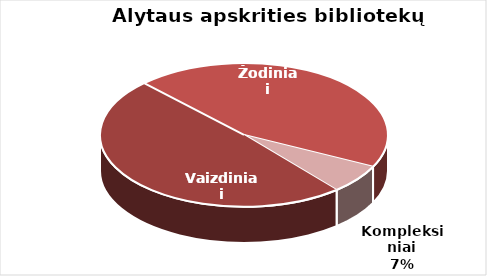
| Category | Series 0 |
|---|---|
| Vaizdiniai | 1347 |
| Žodiniai | 1226 |
| Kompleksiniai | 181 |